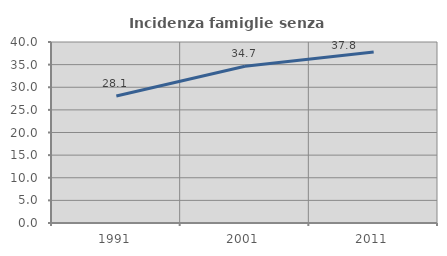
| Category | Incidenza famiglie senza nuclei |
|---|---|
| 1991.0 | 28.065 |
| 2001.0 | 34.655 |
| 2011.0 | 37.765 |